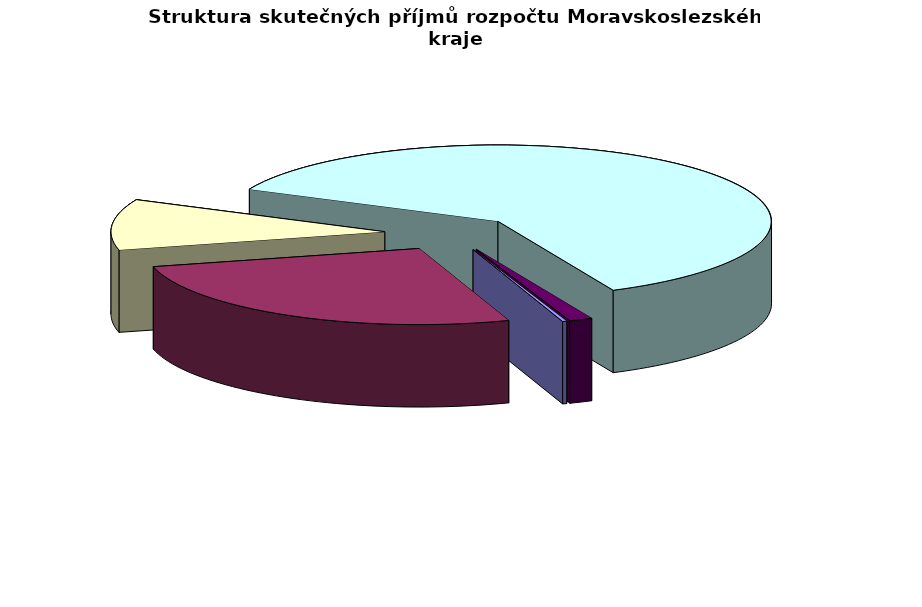
| Category | Čerpání v tis. Kč |
|---|---|
| Kapitálové příjmy | 47410.751 |
| Daňové příjmy | 5050979.618 |
| Investiční dotace | 2051894.213 |
| Neinvestiční dotace | 11674585.62 |
| Nedaňové příjmy | 262004.482 |